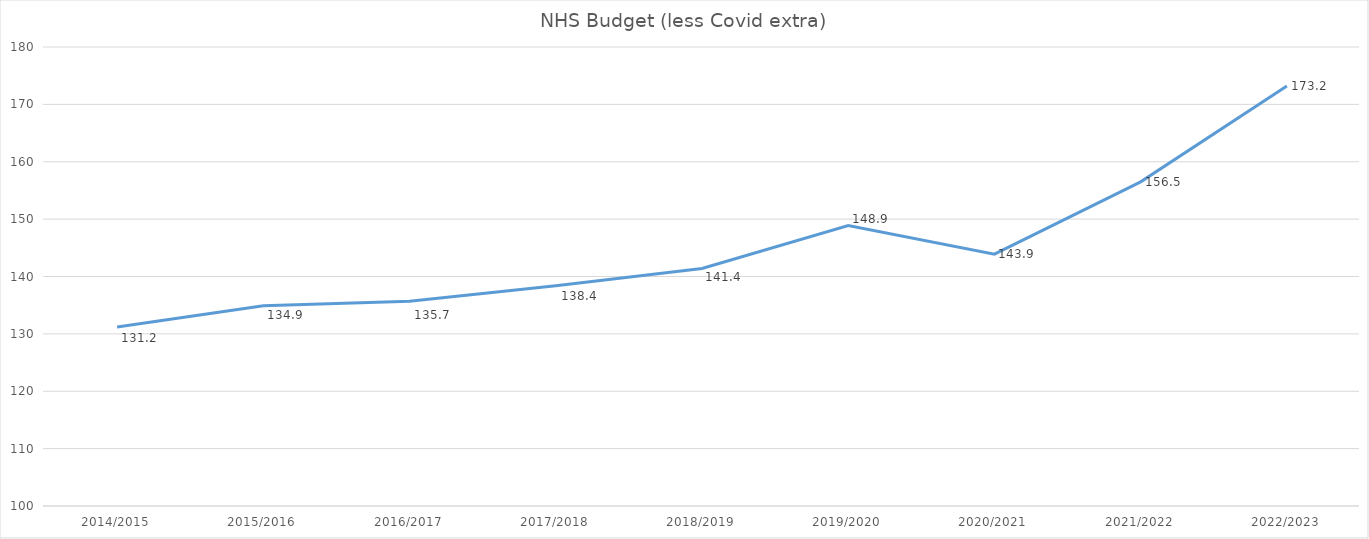
| Category | NHS Budget |
|---|---|
| 2014/2015 | 131.2 |
| 2015/2016 | 134.9 |
| 2016/2017 | 135.7 |
| 2017/2018 | 138.4 |
| 2018/2019 | 141.4 |
| 2019/2020 | 148.9 |
| 2020/2021 | 143.9 |
| 2021/2022 | 156.5 |
| 2022/2023 | 173.2 |